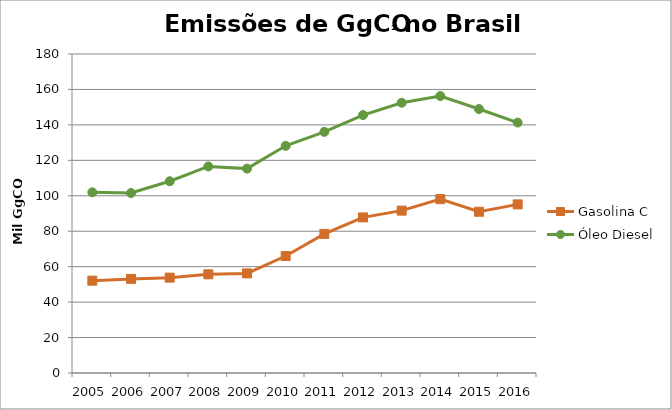
| Category | Gasolina C | Óleo Diesel |
|---|---|---|
| 2005.0 | 52095.071 | 101966.635 |
| 2006.0 | 53099.536 | 101553.331 |
| 2007.0 | 53802.472 | 108191.359 |
| 2008.0 | 55681.009 | 116537.175 |
| 2009.0 | 56199.244 | 115325.333 |
| 2010.0 | 66007.537 | 128187.487 |
| 2011.0 | 78498.749 | 136062.352 |
| 2012.0 | 87802.499 | 145529.385 |
| 2013.0 | 91625.604 | 152485.935 |
| 2014.0 | 98123.828 | 156284.572 |
| 2015.0 | 90986.765 | 148941.121 |
| 2016.0 | 95148.623 | 141307.255 |